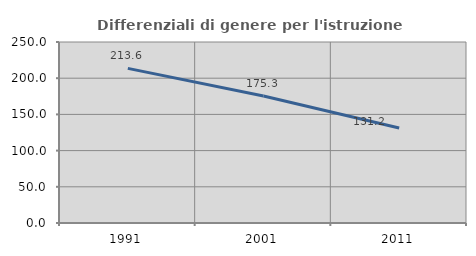
| Category | Differenziali di genere per l'istruzione superiore |
|---|---|
| 1991.0 | 213.585 |
| 2001.0 | 175.309 |
| 2011.0 | 131.206 |